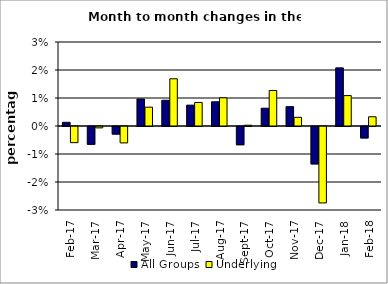
| Category | All Groups | Underlying |
|---|---|---|
| 2017-02-01 | 0.001 | -0.006 |
| 2017-03-01 | -0.006 | 0 |
| 2017-04-01 | -0.003 | -0.006 |
| 2017-05-01 | 0.01 | 0.007 |
| 2017-06-01 | 0.009 | 0.017 |
| 2017-07-01 | 0.007 | 0.008 |
| 2017-08-01 | 0.009 | 0.01 |
| 2017-09-01 | -0.007 | 0 |
| 2017-10-01 | 0.006 | 0.013 |
| 2017-11-01 | 0.007 | 0.003 |
| 2017-12-01 | -0.013 | -0.027 |
| 2018-01-01 | 0.021 | 0.011 |
| 2018-02-01 | -0.004 | 0.003 |